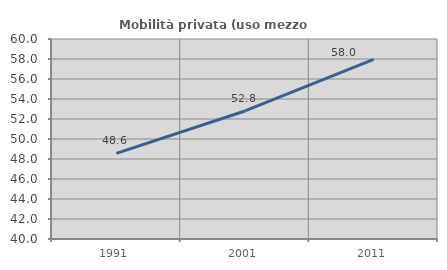
| Category | Mobilità privata (uso mezzo privato) |
|---|---|
| 1991.0 | 48.558 |
| 2001.0 | 52.802 |
| 2011.0 | 57.954 |